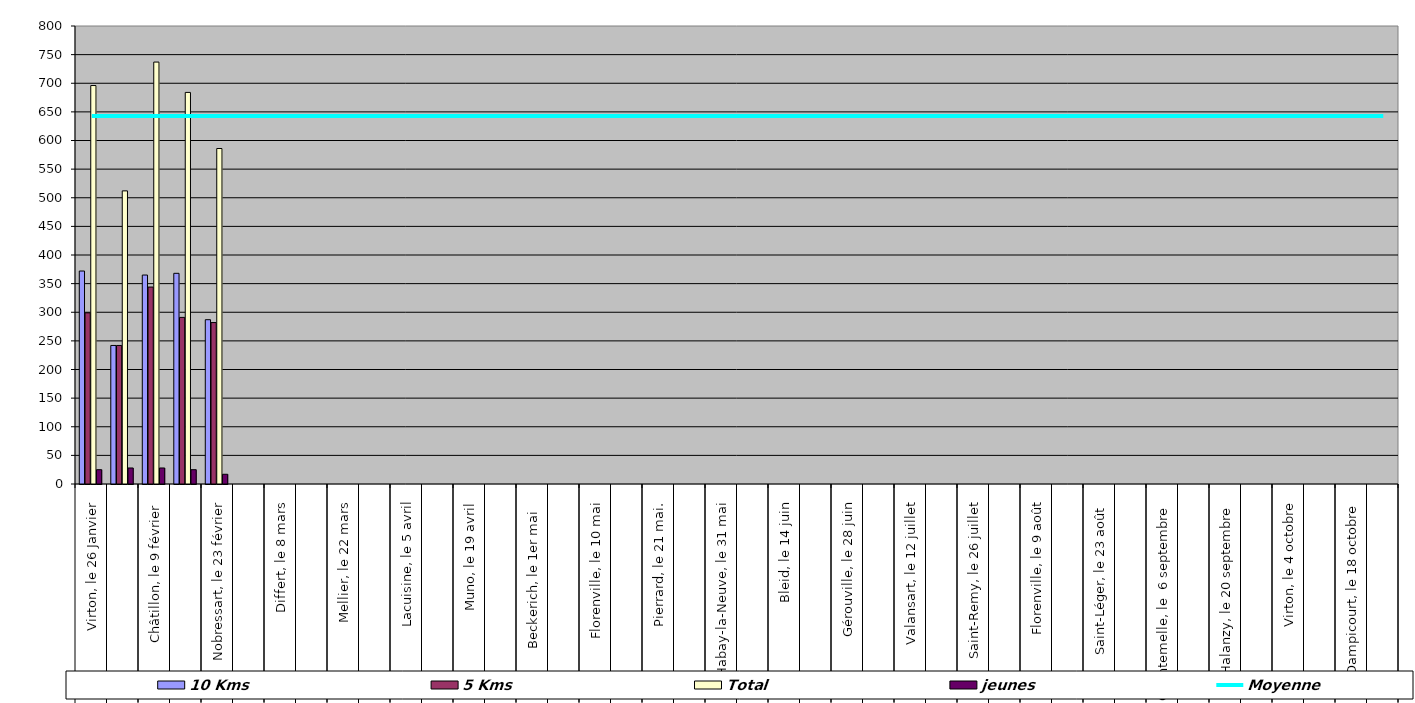
| Category | 10 Kms | 5 Kms | Total | jeunes |
|---|---|---|---|---|
| 0 | 372 | 299 | 696 | 25 |
| 1 | 242 | 242 | 512 | 28 |
| 2 | 365 | 344 | 737 | 28 |
| 3 | 368 | 291 | 684 | 25 |
| 4 | 287 | 282 | 586 | 17 |
| 5 | 0 | 0 | 0 | 0 |
| 6 | 0 | 0 | 0 | 0 |
| 7 | 0 | 0 | 0 | 0 |
| 8 | 0 | 0 | 0 | 0 |
| 9 | 0 | 0 | 0 | 0 |
| 10 | 0 | 0 | 0 | 0 |
| 11 | 0 | 0 | 0 | 0 |
| 12 | 0 | 0 | 0 | 0 |
| 13 | 0 | 0 | 0 | 0 |
| 14 | 0 | 0 | 0 | 0 |
| 15 | 0 | 0 | 0 | 0 |
| 16 | 0 | 0 | 0 | 0 |
| 17 | 0 | 0 | 0 | 0 |
| 18 | 0 | 0 | 0 | 0 |
| 19 | 0 | 0 | 0 | 0 |
| 20 | 0 | 0 | 0 | 0 |
| 21 | 0 | 0 | 0 | 0 |
| 22 | 0 | 0 | 0 | 0 |
| 23 | 0 | 0 | 0 | 0 |
| 24 | 0 | 0 | 0 | 0 |
| 25 | 0 | 0 | 0 | 0 |
| 26 | 0 | 0 | 0 | 0 |
| 27 | 0 | 0 | 0 | 0 |
| 28 | 0 | 0 | 0 | 0 |
| 29 | 0 | 0 | 0 | 0 |
| 30 | 0 | 0 | 0 | 0 |
| 31 | 0 | 0 | 0 | 0 |
| 32 | 0 | 0 | 0 | 0 |
| 33 | 0 | 0 | 0 | 0 |
| 34 | 0 | 0 | 0 | 0 |
| 35 | 0 | 0 | 0 | 0 |
| 36 | 0 | 0 | 0 | 0 |
| 37 | 0 | 0 | 0 | 0 |
| 38 | 0 | 0 | 0 | 0 |
| 39 | 0 | 0 | 0 | 0 |
| 40 | 0 | 0 | 0 | 0 |
| 41 | 0 | 0 | 0 | 0 |